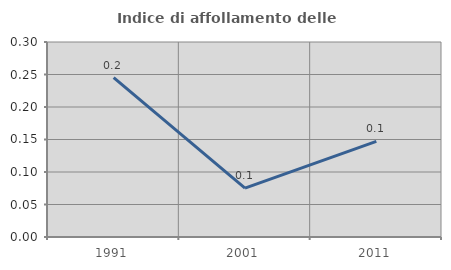
| Category | Indice di affollamento delle abitazioni  |
|---|---|
| 1991.0 | 0.245 |
| 2001.0 | 0.075 |
| 2011.0 | 0.147 |